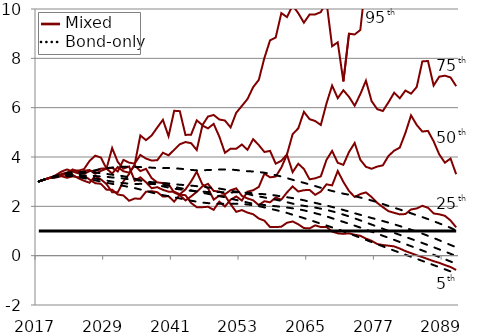
| Category | 95th percentile | 75th percentile | 50th percentile | 25th percentile | 5th percentile | Danger (TF Ratio < 1) |
|---|---|---|---|---|---|---|
| 2017.0 | 3.01 | 3.01 | 3.01 | 3.01 | 3.01 | 1 |
| 2018.0 | 3.087 | 3.087 | 3.087 | 3.087 | 3.087 | 1 |
| 2019.0 | 3.163 | 3.165 | 3.16 | 3.16 | 3.14 | 1 |
| 2020.0 | 3.221 | 3.238 | 3.225 | 3.214 | 3.181 | 1 |
| 2021.0 | 3.276 | 3.304 | 3.27 | 3.252 | 3.225 | 1 |
| 2022.0 | 3.321 | 3.355 | 3.302 | 3.271 | 3.234 | 1 |
| 2023.0 | 3.334 | 3.39 | 3.306 | 3.258 | 3.228 | 1 |
| 2024.0 | 3.343 | 3.392 | 3.282 | 3.232 | 3.19 | 1 |
| 2025.0 | 3.361 | 3.386 | 3.252 | 3.197 | 3.139 | 1 |
| 2026.0 | 3.408 | 3.377 | 3.247 | 3.166 | 3.101 | 1 |
| 2027.0 | 3.463 | 3.365 | 3.23 | 3.124 | 3.053 | 1 |
| 2028.0 | 3.512 | 3.345 | 3.21 | 3.084 | 3.002 | 1 |
| 2029.0 | 3.55 | 3.314 | 3.196 | 3.044 | 2.956 | 1 |
| 2030.0 | 3.57 | 3.283 | 3.17 | 3.004 | 2.912 | 1 |
| 2031.0 | 3.594 | 3.258 | 3.157 | 2.965 | 2.869 | 1 |
| 2032.0 | 3.605 | 3.22 | 3.13 | 2.941 | 2.83 | 1 |
| 2033.0 | 3.608 | 3.179 | 3.095 | 2.92 | 2.784 | 1 |
| 2034.0 | 3.594 | 3.122 | 3.065 | 2.905 | 2.741 | 1 |
| 2035.0 | 3.592 | 3.057 | 3.043 | 2.912 | 2.683 | 1 |
| 2036.0 | 3.579 | 2.992 | 3.01 | 2.906 | 2.621 | 1 |
| 2037.0 | 3.569 | 2.927 | 2.98 | 2.911 | 2.561 | 1 |
| 2038.0 | 3.551 | 2.868 | 2.963 | 2.907 | 2.504 | 1 |
| 2039.0 | 3.55 | 2.809 | 2.942 | 2.874 | 2.454 | 1 |
| 2040.0 | 3.554 | 2.762 | 2.928 | 2.839 | 2.411 | 1 |
| 2041.0 | 3.544 | 2.716 | 2.898 | 2.788 | 2.367 | 1 |
| 2042.0 | 3.526 | 2.687 | 2.876 | 2.744 | 2.32 | 1 |
| 2043.0 | 3.504 | 2.656 | 2.86 | 2.698 | 2.269 | 1 |
| 2044.0 | 3.477 | 2.629 | 2.839 | 2.649 | 2.229 | 1 |
| 2045.0 | 3.458 | 2.604 | 2.818 | 2.601 | 2.189 | 1 |
| 2046.0 | 3.459 | 2.594 | 2.795 | 2.548 | 2.153 | 1 |
| 2047.0 | 3.473 | 2.581 | 2.765 | 2.507 | 2.13 | 1 |
| 2048.0 | 3.482 | 2.578 | 2.743 | 2.455 | 2.109 | 1 |
| 2049.0 | 3.493 | 2.578 | 2.72 | 2.412 | 2.104 | 1 |
| 2050.0 | 3.493 | 2.573 | 2.681 | 2.368 | 2.098 | 1 |
| 2051.0 | 3.491 | 2.563 | 2.633 | 2.311 | 2.1 | 1 |
| 2052.0 | 3.471 | 2.57 | 2.595 | 2.259 | 2.107 | 1 |
| 2053.0 | 3.442 | 2.564 | 2.557 | 2.21 | 2.098 | 1 |
| 2054.0 | 3.422 | 2.55 | 2.503 | 2.153 | 2.076 | 1 |
| 2055.0 | 3.414 | 2.53 | 2.445 | 2.108 | 2.045 | 1 |
| 2056.0 | 3.388 | 2.507 | 2.403 | 2.074 | 2.005 | 1 |
| 2057.0 | 3.364 | 2.492 | 2.36 | 2.053 | 1.958 | 1 |
| 2058.0 | 3.316 | 2.47 | 2.313 | 2.028 | 1.903 | 1 |
| 2059.0 | 3.261 | 2.438 | 2.27 | 2.004 | 1.85 | 1 |
| 2060.0 | 3.208 | 2.402 | 2.218 | 1.983 | 1.794 | 1 |
| 2061.0 | 3.143 | 2.368 | 2.167 | 1.952 | 1.733 | 1 |
| 2062.0 | 3.076 | 2.334 | 2.109 | 1.92 | 1.659 | 1 |
| 2063.0 | 3.012 | 2.295 | 2.057 | 1.882 | 1.594 | 1 |
| 2064.0 | 2.953 | 2.246 | 2.02 | 1.838 | 1.522 | 1 |
| 2065.0 | 2.887 | 2.186 | 1.986 | 1.784 | 1.448 | 1 |
| 2066.0 | 2.821 | 2.14 | 1.949 | 1.721 | 1.373 | 1 |
| 2067.0 | 2.752 | 2.086 | 1.905 | 1.66 | 1.297 | 1 |
| 2068.0 | 2.685 | 2.033 | 1.857 | 1.593 | 1.221 | 1 |
| 2069.0 | 2.622 | 1.976 | 1.799 | 1.517 | 1.146 | 1 |
| 2070.0 | 2.569 | 1.916 | 1.738 | 1.443 | 1.068 | 1 |
| 2071.0 | 2.512 | 1.852 | 1.665 | 1.369 | 0.985 | 1 |
| 2072.0 | 2.471 | 1.789 | 1.592 | 1.294 | 0.899 | 1 |
| 2073.0 | 2.415 | 1.72 | 1.514 | 1.217 | 0.814 | 1 |
| 2074.0 | 2.357 | 1.656 | 1.431 | 1.139 | 0.727 | 1 |
| 2075.0 | 2.304 | 1.593 | 1.346 | 1.056 | 0.64 | 1 |
| 2076.0 | 2.235 | 1.528 | 1.26 | 0.972 | 0.552 | 1 |
| 2077.0 | 2.171 | 1.469 | 1.175 | 0.891 | 0.464 | 1 |
| 2078.0 | 2.091 | 1.404 | 1.09 | 0.807 | 0.377 | 1 |
| 2079.0 | 2.017 | 1.338 | 1.007 | 0.724 | 0.29 | 1 |
| 2080.0 | 1.942 | 1.271 | 0.926 | 0.64 | 0.205 | 1 |
| 2081.0 | 1.872 | 1.2 | 0.844 | 0.555 | 0.122 | 1 |
| 2082.0 | 1.797 | 1.127 | 0.761 | 0.47 | 0.04 | 1 |
| 2083.0 | 1.717 | 1.052 | 0.68 | 0.384 | -0.043 | 1 |
| 2084.0 | 1.64 | 0.974 | 0.598 | 0.298 | -0.127 | 1 |
| 2085.0 | 1.564 | 0.892 | 0.514 | 0.211 | -0.213 | 1 |
| 2086.0 | 1.483 | 0.806 | 0.428 | 0.123 | -0.297 | 1 |
| 2087.0 | 1.397 | 0.717 | 0.341 | 0.035 | -0.382 | 1 |
| 2088.0 | 1.309 | 0.625 | 0.255 | -0.054 | -0.467 | 1 |
| 2089.0 | 1.221 | 0.53 | 0.168 | -0.145 | -0.553 | 1 |
| 2090.0 | 1.13 | 0.432 | 0.076 | -0.237 | -0.638 | 1 |
| 2091.0 | 1.014 | 0.34 | -0.015 | -0.325 | -0.703 | 1 |